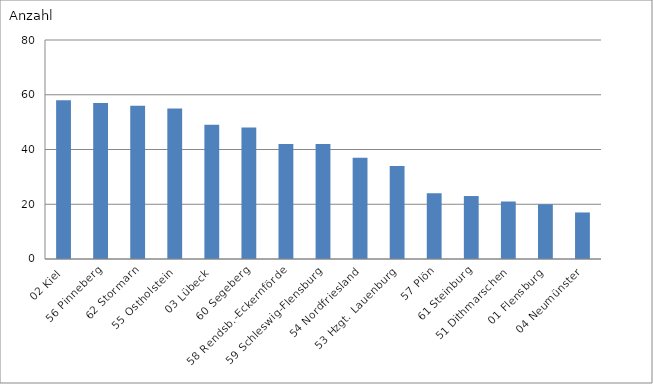
| Category | 02 Kiel |
|---|---|
| 02 Kiel | 58 |
| 56 Pinneberg | 57 |
| 62 Stormarn | 56 |
| 55 Ostholstein | 55 |
| 03 Lübeck | 49 |
| 60 Segeberg | 48 |
| 58 Rendsb.-Eckernförde | 42 |
| 59 Schleswig-Flensburg | 42 |
| 54 Nordfriesland | 37 |
| 53 Hzgt. Lauenburg | 34 |
| 57 Plön | 24 |
| 61 Steinburg | 23 |
| 51 Dithmarschen | 21 |
| 01 Flensburg | 20 |
| 04 Neumünster | 17 |